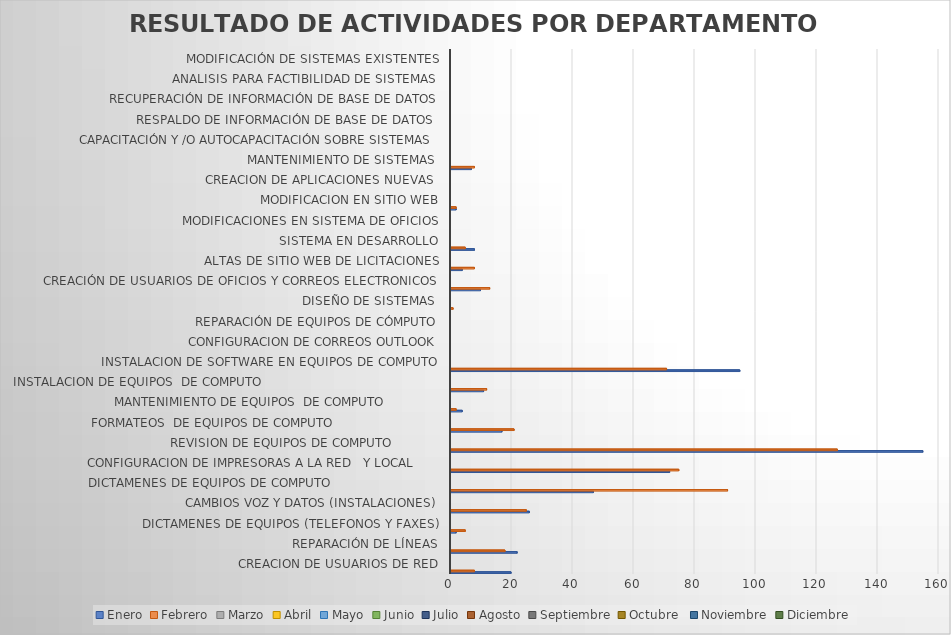
| Category | Enero | Febrero | Marzo | Abril | Mayo | Junio | Julio | Agosto | Septiembre | Octubre  | Noviembre | Diciembre |
|---|---|---|---|---|---|---|---|---|---|---|---|---|
| CREACION DE USUARIOS DE RED | 20 | 8 |  |  |  |  |  |  |  |  |  |  |
| REPARACIÓN DE LÍNEAS | 22 | 18 |  |  |  |  |  |  |  |  |  |  |
| DICTAMENES DE EQUIPOS (TELEFONOS Y FAXES) | 2 | 5 |  |  |  |  |  |  |  |  |  |  |
| CAMBIOS VOZ Y DATOS (INSTALACIONES) | 26 | 25 |  |  |  |  |  |  |  |  |  |  |
| DICTAMENES DE EQUIPOS DE COMPUTO                             | 47 | 91 |  |  |  |  |  |  |  |  |  |  |
| CONFIGURACION DE IMPRESORAS A LA RED   Y LOCAL       | 72 | 75 |  |  |  |  |  |  |  |  |  |  |
| REVISION DE EQUIPOS DE COMPUTO             | 155 | 127 |  |  |  |  |  |  |  |  |  |  |
| FORMATEOS  DE EQUIPOS DE COMPUTO                            | 17 | 21 |  |  |  |  |  |  |  |  |  |  |
| MANTENIMIENTO DE EQUIPOS  DE COMPUTO               | 4 | 2 |  |  |  |  |  |  |  |  |  |  |
| INSTALACION DE EQUIPOS  DE COMPUTO                                               | 11 | 12 |  |  |  |  |  |  |  |  |  |  |
| INSTALACION DE SOFTWARE EN EQUIPOS DE COMPUTO | 95 | 71 |  |  |  |  |  |  |  |  |  |  |
| CONFIGURACION DE CORREOS OUTLOOK | 0 | 0 |  |  |  |  |  |  |  |  |  |  |
| REPARACIÓN DE EQUIPOS DE CÓMPUTO | 0 | 0 |  |  |  |  |  |  |  |  |  |  |
| DISEÑO DE SISTEMAS  | 0 | 1 |  |  |  |  |  |  |  |  |  |  |
| CREACIÓN DE USUARIOS DE OFICIOS Y CORREOS ELECTRONICOS | 10 | 13 |  |  |  |  |  |  |  |  |  |  |
| ALTAS DE SITIO WEB DE LICITACIONES | 4 | 8 |  |  |  |  |  |  |  |  |  |  |
| SISTEMA EN DESARROLLO | 8 | 5 |  |  |  |  |  |  |  |  |  |  |
| MODIFICACIONES EN SISTEMA DE OFICIOS | 0 | 0 |  |  |  |  |  |  |  |  |  |  |
| MODIFICACION EN SITIO WEB | 2 | 2 |  |  |  |  |  |  |  |  |  |  |
| CREACION DE APLICACIONES NUEVAS  | 0 | 0 |  |  |  |  |  |  |  |  |  |  |
| MANTENIMIENTO DE SISTEMAS  | 7 | 8 |  |  |  |  |  |  |  |  |  |  |
| CAPACITACIÓN Y /O AUTOCAPACITACIÓN SOBRE SISTEMAS  | 0 | 0 |  |  |  |  |  |  |  |  |  |  |
| RESPALDO DE INFORMACIÓN DE BASE DE DATOS  | 0 | 0 |  |  |  |  |  |  |  |  |  |  |
| RECUPERACIÓN DE INFORMACIÓN DE BASE DE DATOS | 0 | 0 |  |  |  |  |  |  |  |  |  |  |
| ANALISIS PARA FACTIBILIDAD DE SISTEMAS  | 0 | 0 |  |  |  |  |  |  |  |  |  |  |
| MODIFICACIÓN DE SISTEMAS EXISTENTES | 0 | 0 |  |  |  |  |  |  |  |  |  |  |